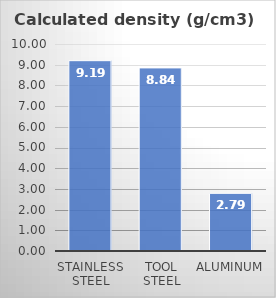
| Category | Calculated density (g/cm3) |
|---|---|
| Stainless Steel | 9.194 |
| Tool Steel | 8.844 |
| Aluminum | 2.786 |